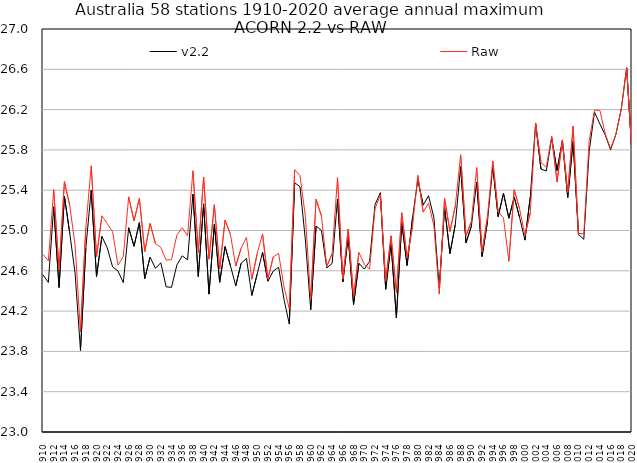
| Category | v2.2 | Raw |
|---|---|---|
| 1910 | 24.56 | 24.763 |
| 1911 | 24.485 | 24.7 |
| 1912 | 25.235 | 25.405 |
| 1913 | 24.434 | 24.614 |
| 1914 | 25.339 | 25.485 |
| 1915 | 24.972 | 25.248 |
| 1916 | 24.572 | 24.85 |
| 1917 | 23.809 | 23.996 |
| 1918 | 24.827 | 25.027 |
| 1919 | 25.4 | 25.642 |
| 1920 | 24.542 | 24.741 |
| 1921 | 24.941 | 25.146 |
| 1922 | 24.828 | 25.069 |
| 1923 | 24.639 | 24.987 |
| 1924 | 24.599 | 24.656 |
| 1925 | 24.482 | 24.743 |
| 1926 | 25.028 | 25.334 |
| 1927 | 24.844 | 25.096 |
| 1928 | 25.078 | 25.319 |
| 1929 | 24.523 | 24.791 |
| 1930 | 24.736 | 25.069 |
| 1931 | 24.625 | 24.87 |
| 1932 | 24.68 | 24.832 |
| 1933 | 24.441 | 24.706 |
| 1934 | 24.436 | 24.711 |
| 1935 | 24.657 | 24.954 |
| 1936 | 24.748 | 25.026 |
| 1937 | 24.709 | 24.948 |
| 1938 | 25.361 | 25.593 |
| 1939 | 24.543 | 24.783 |
| 1940 | 25.264 | 25.531 |
| 1941 | 24.368 | 24.716 |
| 1942 | 25.064 | 25.256 |
| 1943 | 24.486 | 24.617 |
| 1944 | 24.84 | 25.103 |
| 1945 | 24.651 | 24.961 |
| 1946 | 24.451 | 24.648 |
| 1947 | 24.674 | 24.823 |
| 1948 | 24.723 | 24.933 |
| 1949 | 24.355 | 24.516 |
| 1950 | 24.568 | 24.769 |
| 1951 | 24.783 | 24.966 |
| 1952 | 24.496 | 24.518 |
| 1953 | 24.597 | 24.738 |
| 1954 | 24.636 | 24.774 |
| 1955 | 24.318 | 24.441 |
| 1956 | 24.071 | 24.222 |
| 1957 | 25.474 | 25.603 |
| 1958 | 25.435 | 25.545 |
| 1959 | 24.906 | 25.141 |
| 1960 | 24.213 | 24.32 |
| 1961 | 25.044 | 25.31 |
| 1962 | 25 | 25.145 |
| 1963 | 24.628 | 24.643 |
| 1964 | 24.674 | 24.771 |
| 1965 | 25.311 | 25.524 |
| 1966 | 24.49 | 24.518 |
| 1967 | 24.939 | 25.014 |
| 1968 | 24.265 | 24.347 |
| 1969 | 24.674 | 24.782 |
| 1970 | 24.617 | 24.665 |
| 1971 | 24.694 | 24.616 |
| 1972 | 25.255 | 25.213 |
| 1973 | 25.374 | 25.355 |
| 1974 | 24.417 | 24.497 |
| 1975 | 24.87 | 24.948 |
| 1976 | 24.134 | 24.384 |
| 1977 | 25.077 | 25.176 |
| 1978 | 24.653 | 24.728 |
| 1979 | 25.12 | 25.034 |
| 1980 | 25.504 | 25.547 |
| 1981 | 25.252 | 25.182 |
| 1982 | 25.345 | 25.272 |
| 1983 | 25.131 | 25.05 |
| 1984 | 24.435 | 24.369 |
| 1985 | 25.228 | 25.32 |
| 1986 | 24.771 | 24.99 |
| 1987 | 25.059 | 25.242 |
| 1988 | 25.634 | 25.751 |
| 1989 | 24.877 | 24.947 |
| 1990 | 25.044 | 25.089 |
| 1991 | 25.481 | 25.625 |
| 1992 | 24.741 | 24.786 |
| 1993 | 25.085 | 25.135 |
| 1994 | 25.635 | 25.69 |
| 1995 | 25.137 | 25.186 |
| 1996 | 25.368 | 25.126 |
| 1997 | 25.122 | 24.695 |
| 1998 | 25.33 | 25.404 |
| 1999 | 25.132 | 25.215 |
| 2000 | 24.904 | 24.95 |
| 2001 | 25.331 | 25.174 |
| 2002 | 26.063 | 26.062 |
| 2003 | 25.61 | 25.674 |
| 2004 | 25.591 | 25.628 |
| 2005 | 25.917 | 25.935 |
| 2006 | 25.595 | 25.482 |
| 2007 | 25.891 | 25.899 |
| 2008 | 25.327 | 25.379 |
| 2009 | 25.885 | 26.036 |
| 2010 | 24.962 | 24.971 |
| 2011 | 24.913 | 24.965 |
| 2012 | 25.785 | 25.89 |
| 2013 | 26.175 | 26.195 |
| 2014 | 26.057 | 26.193 |
| 2015 | 25.949 | 25.96 |
| 2016 | 25.801 | 25.814 |
| 2017 | 25.955 | 25.955 |
| 2018 | 26.208 | 26.204 |
| 2019 | 26.614 | 26.619 |
| 2020 | 25.76 | 25.761 |